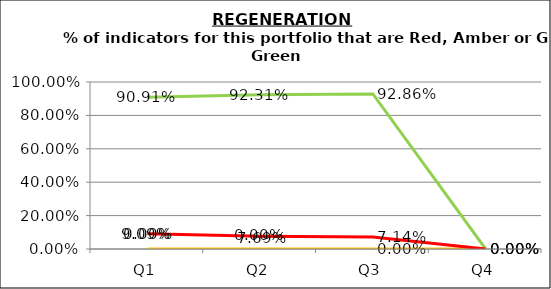
| Category | Green | Amber | Red |
|---|---|---|---|
| Q1 | 0.909 | 0 | 0.091 |
| Q2 | 0.923 | 0 | 0.077 |
| Q3 | 0.929 | 0 | 0.071 |
| Q4 | 0 | 0 | 0 |